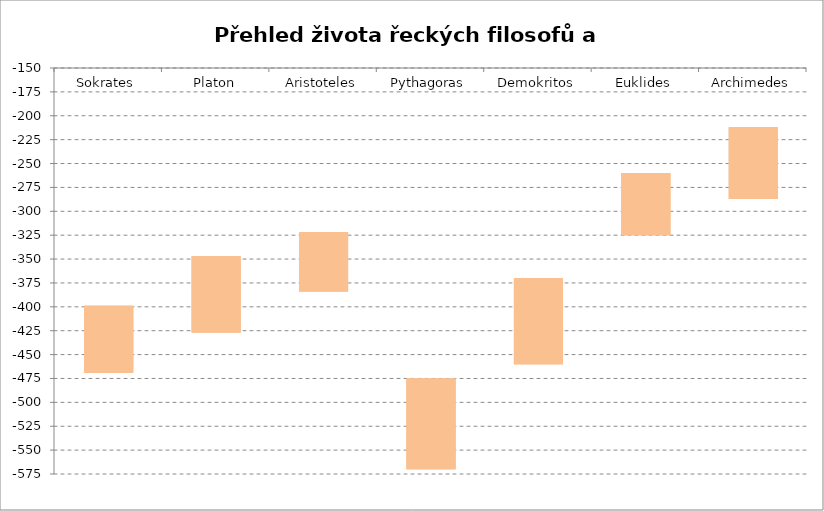
| Category | narozen | Series 1 | zemřel |
|---|---|---|---|
| Sokrates | -469 |  | -399 |
| Platon | -427 |  | -347 |
| Aristoteles | -384 |  | -322 |
| Pythagoras | -570 |  | -475 |
| Demokritos | -460 |  | -370 |
| Euklides | -325 |  | -260 |
| Archimedes | -287 |  | -212 |